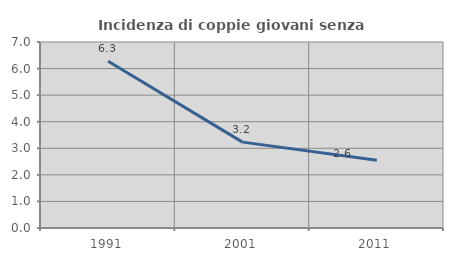
| Category | Incidenza di coppie giovani senza figli |
|---|---|
| 1991.0 | 6.275 |
| 2001.0 | 3.232 |
| 2011.0 | 2.551 |